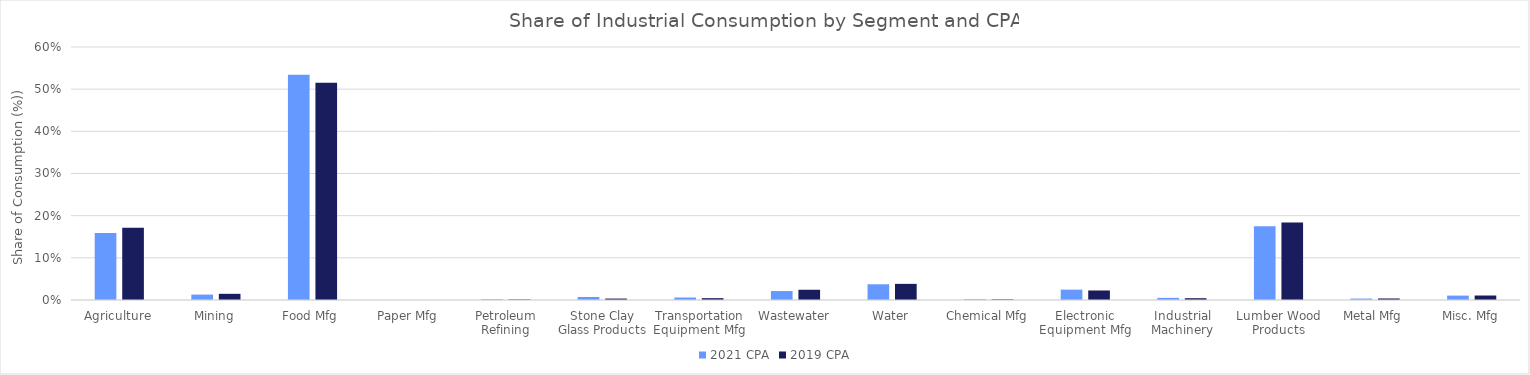
| Category | 2021 CPA | 2019 CPA |
|---|---|---|
| Agriculture | 0.159 | 0.172 |
| Mining | 0.013 | 0.015 |
| Food Mfg | 0.534 | 0.515 |
| Paper Mfg | 0 | 0 |
| Petroleum Refining | 0.002 | 0.001 |
| Stone Clay Glass Products | 0.007 | 0.003 |
| Transportation Equipment Mfg | 0.006 | 0.004 |
| Wastewater | 0.021 | 0.024 |
| Water | 0.037 | 0.038 |
| Chemical Mfg | 0.002 | 0.002 |
| Electronic Equipment Mfg | 0.025 | 0.023 |
| Industrial Machinery | 0.005 | 0.004 |
| Lumber Wood Products | 0.175 | 0.184 |
| Metal Mfg | 0.003 | 0.004 |
| Misc. Mfg | 0.01 | 0.011 |